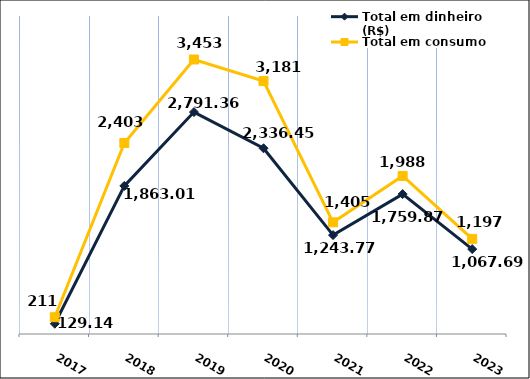
| Category | Total em dinheiro (R$) |
|---|---|
| 2017.0 | 129.14 |
| 2018.0 | 1863.01 |
| 2019.0 | 2791.36 |
| 2020.0 | 2336.45 |
| 2021.0 | 1243.77 |
| 2022.0 | 1759.87 |
| 2023.0 | 1067.69 |